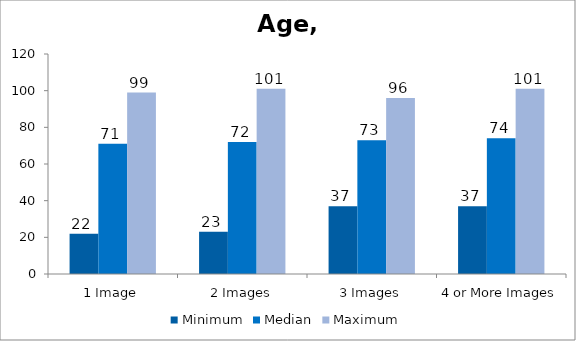
| Category | Minimum | Median | Maximum |
|---|---|---|---|
| 1 Image | 22 | 71 | 99 |
| 2 Images | 23 | 72 | 101 |
| 3 Images | 37 | 73 | 96 |
| 4 or More Images | 37 | 74 | 101 |